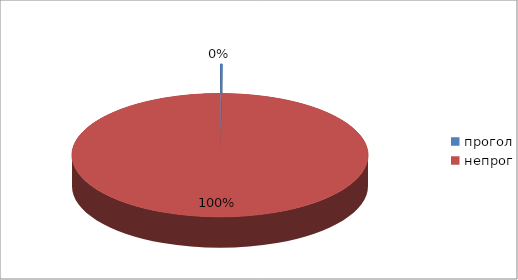
| Category | Series 0 |
|---|---|
| прогол | 3 |
| непрог | 1503 |